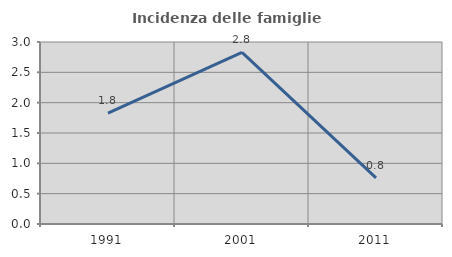
| Category | Incidenza delle famiglie numerose |
|---|---|
| 1991.0 | 1.829 |
| 2001.0 | 2.83 |
| 2011.0 | 0.76 |